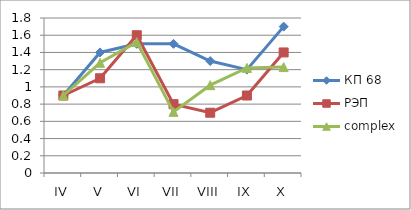
| Category | КП 68 | РЭП  | complex |
|---|---|---|---|
| IV | 0.9 | 0.9 | 0.9 |
| V | 1.4 | 1.1 | 1.28 |
| VI | 1.5 | 1.6 | 1.52 |
| VII | 1.5 | 0.8 | 0.71 |
| VIII | 1.3 | 0.7 | 1.02 |
| IX | 1.2 | 0.9 | 1.22 |
| X | 1.7 | 1.4 | 1.23 |